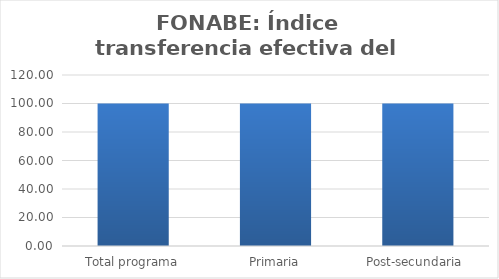
| Category | Índice transferencia efectiva del gasto (ITG) |
|---|---|
| Total programa | 100 |
| Primaria | 100 |
| Post-secundaria  | 100 |